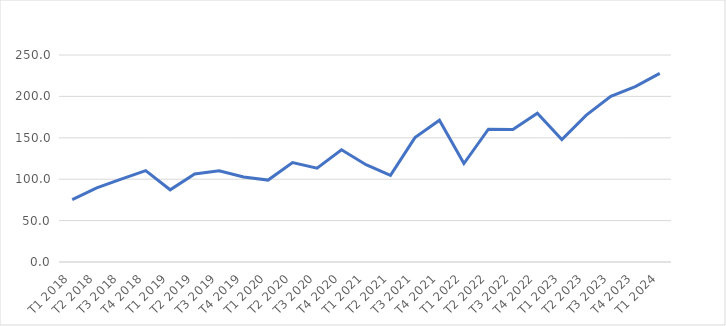
| Category | Series 0 |
|---|---|
| T1 2018 | 75.406 |
| T2 2018 | 89.483 |
| T3 2018 | 100.164 |
| T4 2018 | 110.315 |
| T1 2019 | 87.212 |
| T2 2019 | 106.398 |
| T3 2019 | 110.139 |
| T4 2019 | 102.619 |
| T1 2020 | 98.935 |
| T2 2020 | 120.13 |
| T3 2020 | 113.234 |
| T4 2020 | 135.513 |
| T1 2021 | 117.535 |
| T2 2021 | 104.61 |
| T3 2021 | 150.281 |
| T4 2021 | 171.259 |
| T1 2022 | 118.917 |
| T2 2022 | 160.357 |
| T3 2022 | 160.058 |
| T4 2022 | 179.666 |
| T1 2023 | 147.962 |
| T2 2023 | 177.387 |
| T3 2023 | 200.173 |
| T4 2023 | 211.908 |
| T1 2024 | 227.755 |